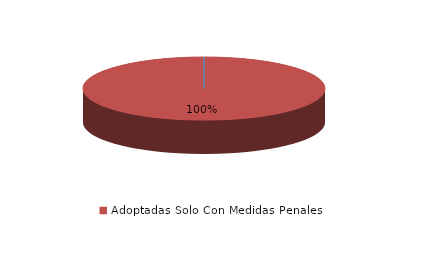
| Category | Series 0 |
|---|---|
| Denegadas | 0 |
| Adoptadas Solo Con Medidas Penales | 4 |
| Adoptadas Con Medidas Civiles Y Penales | 0 |
| Adoptadas Con Medidas Solo Civiles | 0 |